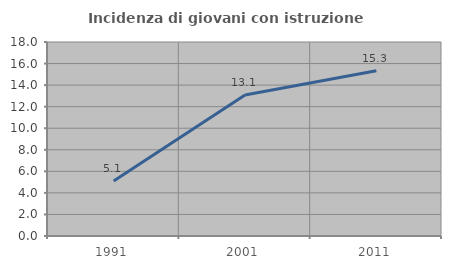
| Category | Incidenza di giovani con istruzione universitaria |
|---|---|
| 1991.0 | 5.114 |
| 2001.0 | 13.091 |
| 2011.0 | 15.339 |